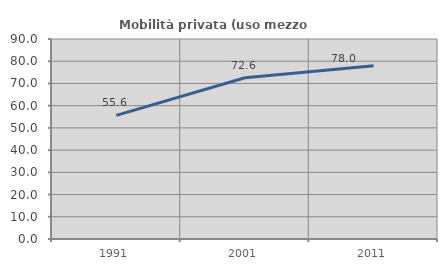
| Category | Mobilità privata (uso mezzo privato) |
|---|---|
| 1991.0 | 55.645 |
| 2001.0 | 72.59 |
| 2011.0 | 78.014 |